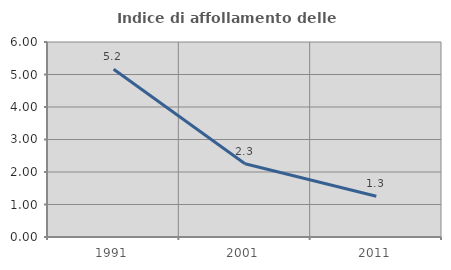
| Category | Indice di affollamento delle abitazioni  |
|---|---|
| 1991.0 | 5.163 |
| 2001.0 | 2.254 |
| 2011.0 | 1.255 |